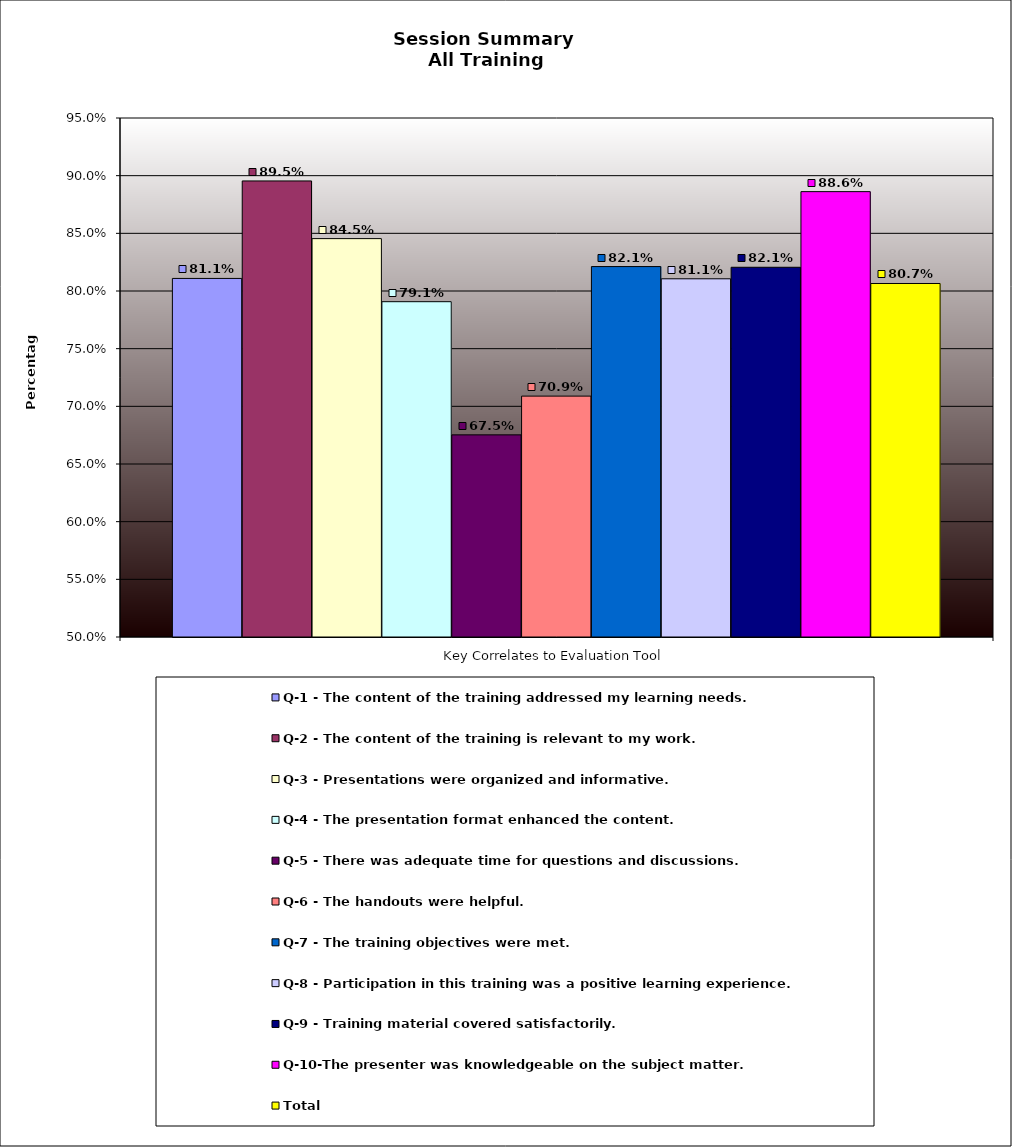
| Category | Q-1 - The content of the training addressed my learning needs. | Q-2 - The content of the training is relevant to my work. | Q-3 - Presentations were organized and informative. | Q-4 - The presentation format enhanced the content. | Q-5 - There was adequate time for questions and discussions. | Q-6 - The handouts were helpful. | Q-7 - The training objectives were met. | Q-8 - Participation in this training was a positive learning experience. | Q-9 - Training material covered satisfactorily. | Q-10-The presenter was knowledgeable on the subject matter. | Total |
|---|---|---|---|---|---|---|---|---|---|---|---|
| Key Correlates to Evaluation Tool | 0.811 | 0.895 | 0.845 | 0.791 | 0.675 | 0.709 | 0.821 | 0.811 | 0.821 | 0.886 | 0.807 |